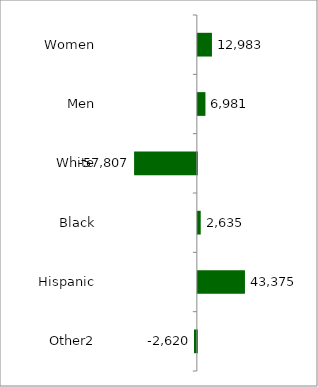
| Category | 50 states and D.C. |
|---|---|
| Women | 12983 |
| Men | 6981 |
| White | -57807 |
| Black | 2635 |
| Hispanic | 43375 |
| Other2 | -2620 |